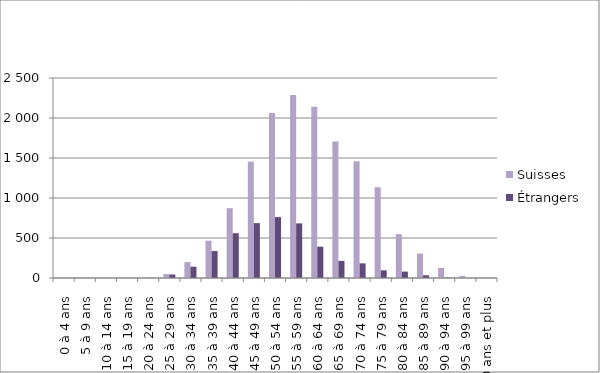
| Category | Suisses | Étrangers |
|---|---|---|
| 0 à 4 ans | 0 | 0 |
| 5 à 9 ans | 0 | 0 |
| 10 à 14 ans | 0 | 0 |
| 15 à 19 ans | 0 | 0 |
| 20 à 24 ans | 1 | 2 |
| 25 à 29 ans | 49 | 44 |
| 30 à 34 ans | 199 | 141 |
| 35 à 39 ans | 466 | 337 |
| 40 à 44 ans | 873 | 560 |
| 45 à 49 ans | 1455 | 686 |
| 50 à 54 ans | 2063 | 761 |
| 55 à 59 ans | 2286 | 683 |
| 60 à 64 ans | 2142 | 391 |
| 65 à 69 ans | 1706 | 214 |
| 70 à 74 ans | 1459 | 183 |
| 75 à 79 ans | 1135 | 96 |
| 80 à 84 ans | 548 | 80 |
| 85 à 89 ans | 305 | 34 |
| 90 à 94 ans | 126 | 4 |
| 95 à 99 ans | 26 | 0 |
| 100 ans et plus | 1 | 0 |